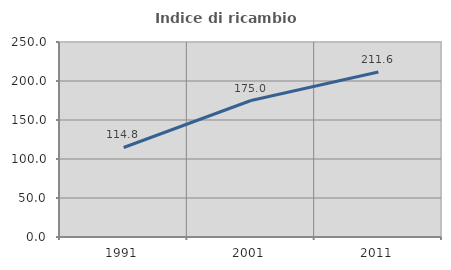
| Category | Indice di ricambio occupazionale  |
|---|---|
| 1991.0 | 114.754 |
| 2001.0 | 175 |
| 2011.0 | 211.628 |